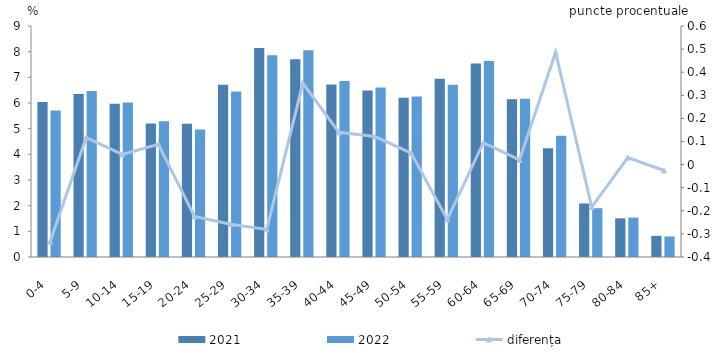
| Category | 2021 | 2022 |
|---|---|---|
| 0-4 | 6.04 | 5.706 |
| 5-9 | 6.349 | 6.466 |
| 10-14 | 5.973 | 6.017 |
| 15-19 | 5.197 | 5.285 |
| 20-24 | 5.189 | 4.965 |
| 25-29 | 6.707 | 6.449 |
| 30-34 | 8.14 | 7.86 |
| 35-39 | 7.702 | 8.054 |
| 40-44 | 6.72 | 6.859 |
| 45-49 | 6.486 | 6.607 |
| 50-54 | 6.208 | 6.258 |
| 55-59 | 6.944 | 6.707 |
| 60-64 | 7.542 | 7.637 |
| 65-69 | 6.146 | 6.166 |
| 70-74 | 4.238 | 4.724 |
| 75-79 | 2.086 | 1.902 |
| 80-84 | 1.506 | 1.536 |
| 85+ | 0.825 | 0.8 |